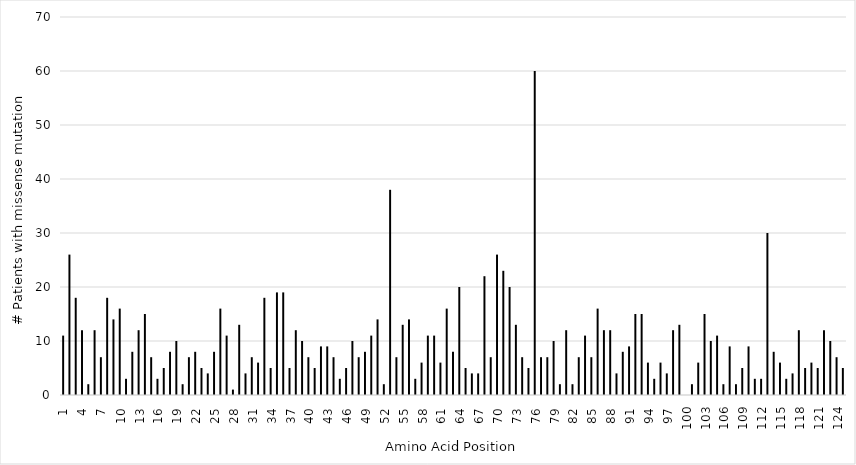
| Category | # mutations |
|---|---|
| 1.0 | 11 |
| 2.0 | 26 |
| 3.0 | 18 |
| 4.0 | 12 |
| 5.0 | 2 |
| 6.0 | 12 |
| 7.0 | 7 |
| 8.0 | 18 |
| 9.0 | 14 |
| 10.0 | 16 |
| 11.0 | 3 |
| 12.0 | 8 |
| 13.0 | 12 |
| 14.0 | 15 |
| 15.0 | 7 |
| 16.0 | 3 |
| 17.0 | 5 |
| 18.0 | 8 |
| 19.0 | 10 |
| 20.0 | 2 |
| 21.0 | 7 |
| 22.0 | 8 |
| 23.0 | 5 |
| 24.0 | 4 |
| 25.0 | 8 |
| 26.0 | 16 |
| 27.0 | 11 |
| 28.0 | 1 |
| 29.0 | 13 |
| 30.0 | 4 |
| 31.0 | 7 |
| 32.0 | 6 |
| 33.0 | 18 |
| 34.0 | 5 |
| 35.0 | 19 |
| 36.0 | 19 |
| 37.0 | 5 |
| 38.0 | 12 |
| 39.0 | 10 |
| 40.0 | 7 |
| 41.0 | 5 |
| 42.0 | 9 |
| 43.0 | 9 |
| 44.0 | 7 |
| 45.0 | 3 |
| 46.0 | 5 |
| 47.0 | 10 |
| 48.0 | 7 |
| 49.0 | 8 |
| 50.0 | 11 |
| 51.0 | 14 |
| 52.0 | 2 |
| 53.0 | 38 |
| 54.0 | 7 |
| 55.0 | 13 |
| 56.0 | 14 |
| 57.0 | 3 |
| 58.0 | 6 |
| 59.0 | 11 |
| 60.0 | 11 |
| 61.0 | 6 |
| 62.0 | 16 |
| 63.0 | 8 |
| 64.0 | 20 |
| 65.0 | 5 |
| 66.0 | 4 |
| 67.0 | 4 |
| 68.0 | 22 |
| 69.0 | 7 |
| 70.0 | 26 |
| 71.0 | 23 |
| 72.0 | 20 |
| 73.0 | 13 |
| 74.0 | 7 |
| 75.0 | 5 |
| 76.0 | 60 |
| 77.0 | 7 |
| 78.0 | 7 |
| 79.0 | 10 |
| 80.0 | 2 |
| 81.0 | 12 |
| 82.0 | 2 |
| 83.0 | 7 |
| 84.0 | 11 |
| 85.0 | 7 |
| 86.0 | 16 |
| 87.0 | 12 |
| 88.0 | 12 |
| 89.0 | 4 |
| 90.0 | 8 |
| 91.0 | 9 |
| 92.0 | 15 |
| 93.0 | 15 |
| 94.0 | 6 |
| 95.0 | 3 |
| 96.0 | 6 |
| 97.0 | 4 |
| 98.0 | 12 |
| 99.0 | 13 |
| 100.0 | 0 |
| 101.0 | 2 |
| 102.0 | 6 |
| 103.0 | 15 |
| 104.0 | 10 |
| 105.0 | 11 |
| 106.0 | 2 |
| 107.0 | 9 |
| 108.0 | 2 |
| 109.0 | 5 |
| 110.0 | 9 |
| 111.0 | 3 |
| 112.0 | 3 |
| 113.0 | 30 |
| 114.0 | 8 |
| 115.0 | 6 |
| 116.0 | 3 |
| 117.0 | 4 |
| 118.0 | 12 |
| 119.0 | 5 |
| 120.0 | 6 |
| 121.0 | 5 |
| 122.0 | 12 |
| 123.0 | 10 |
| 124.0 | 7 |
| 125.0 | 5 |